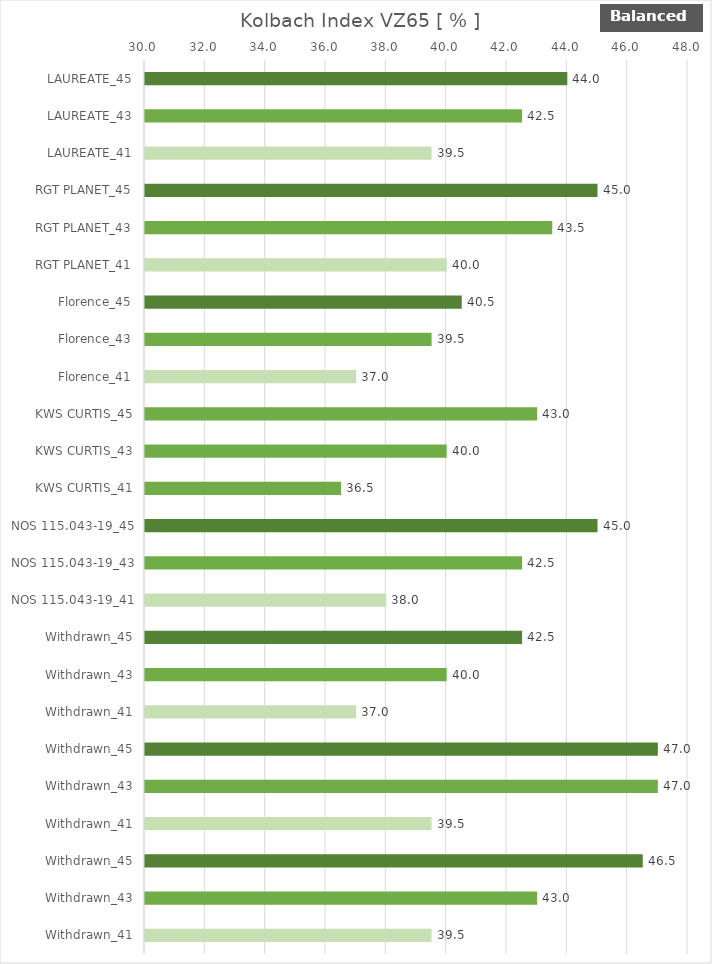
| Category |   Kolbach Index VZ65 [ % ] |
|---|---|
| LAUREATE_45 | 44 |
| LAUREATE_43 | 42.5 |
| LAUREATE_41 | 39.5 |
| RGT PLANET_45 | 45 |
| RGT PLANET_43 | 43.5 |
| RGT PLANET_41 | 40 |
| Florence_45 | 40.5 |
| Florence_43 | 39.5 |
| Florence_41 | 37 |
| KWS CURTIS_45 | 43 |
| KWS CURTIS_43 | 40 |
| KWS CURTIS_41 | 36.5 |
| NOS 115.043-19_45 | 45 |
| NOS 115.043-19_43 | 42.5 |
| NOS 115.043-19_41 | 38 |
| Withdrawn_45 | 42.5 |
| Withdrawn_43 | 40 |
| Withdrawn_41 | 37 |
| Withdrawn_45 | 47 |
| Withdrawn_43 | 47 |
| Withdrawn_41 | 39.5 |
| Withdrawn_45 | 46.5 |
| Withdrawn_43 | 43 |
| Withdrawn_41 | 39.5 |